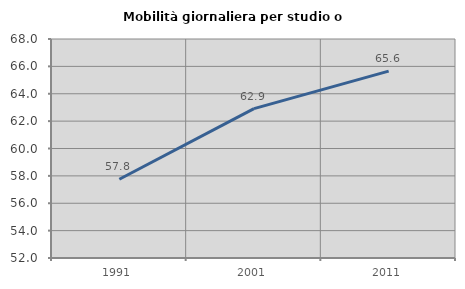
| Category | Mobilità giornaliera per studio o lavoro |
|---|---|
| 1991.0 | 57.754 |
| 2001.0 | 62.912 |
| 2011.0 | 65.65 |